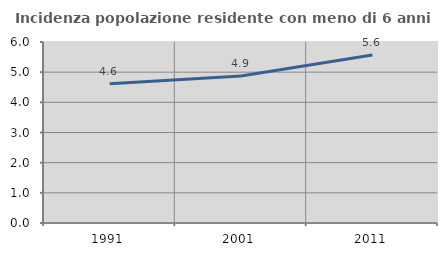
| Category | Incidenza popolazione residente con meno di 6 anni |
|---|---|
| 1991.0 | 4.618 |
| 2001.0 | 4.87 |
| 2011.0 | 5.567 |